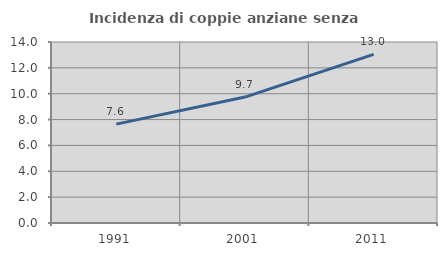
| Category | Incidenza di coppie anziane senza figli  |
|---|---|
| 1991.0 | 7.646 |
| 2001.0 | 9.741 |
| 2011.0 | 13.046 |